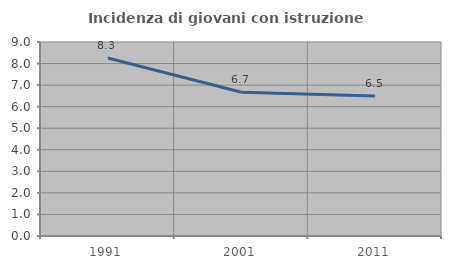
| Category | Incidenza di giovani con istruzione universitaria |
|---|---|
| 1991.0 | 8.257 |
| 2001.0 | 6.667 |
| 2011.0 | 6.494 |